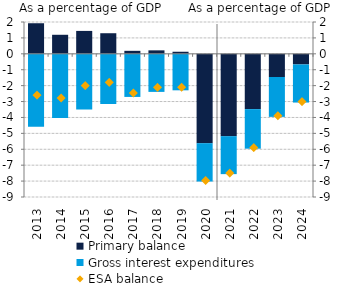
| Category | Primary balance | Gross interest expenditures |
|---|---|---|
| 2013.0 | 1.922 | -4.519 |
| 2014.0 | 1.197 | -3.971 |
| 2015.0 | 1.44 | -3.443 |
| 2016.0 | 1.294 | -3.091 |
| 2017.0 | 0.188 | -2.647 |
| 2018.0 | 0.218 | -2.33 |
| 2019.0 | 0.13 | -2.231 |
| 2020.0 | -5.618 | -2.348 |
| 2021.0 | -5.177 | -2.323 |
| 2022.0 | -3.476 | -2.424 |
| 2023.0 | -1.457 | -2.443 |
| 2024.0 | -0.667 | -2.333 |